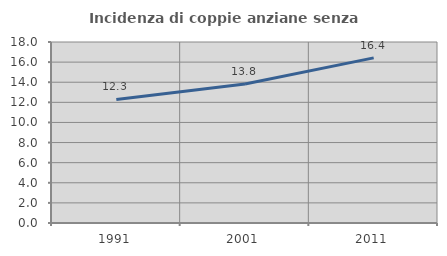
| Category | Incidenza di coppie anziane senza figli  |
|---|---|
| 1991.0 | 12.283 |
| 2001.0 | 13.831 |
| 2011.0 | 16.423 |